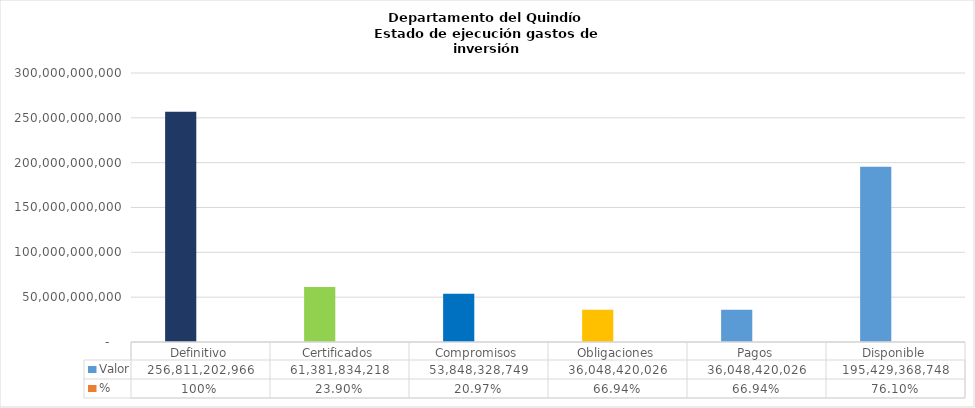
| Category | Valor | % |
|---|---|---|
| Definitivo | 256811202966 | 1 |
| Certificados | 61381834218 | 0.239 |
| Compromisos | 53848328749 | 0.21 |
| Obligaciones | 36048420026 | 0.669 |
| Pagos | 36048420026 | 0.669 |
| Disponible | 195429368748 | 0.761 |